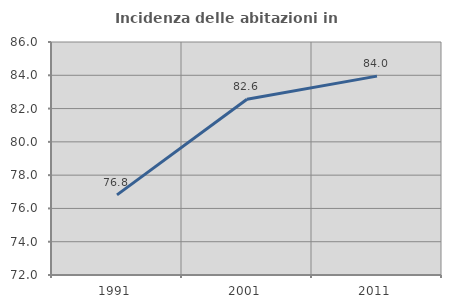
| Category | Incidenza delle abitazioni in proprietà  |
|---|---|
| 1991.0 | 76.813 |
| 2001.0 | 82.558 |
| 2011.0 | 83.951 |